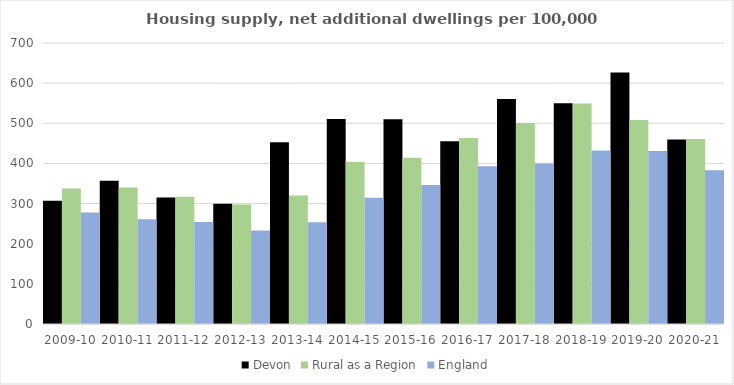
| Category | Devon | Rural as a Region | England |
|---|---|---|---|
| 2009-10 | 306.965 | 337.852 | 277.548 |
| 2010-11 | 356.742 | 340.105 | 260.994 |
| 2011-12 | 315.363 | 317.04 | 254.007 |
| 2012-13 | 299.561 | 297.763 | 233.153 |
| 2013-14 | 452.944 | 319.835 | 253.602 |
| 2014-15 | 510.656 | 403.796 | 314.256 |
| 2015-16 | 510.224 | 414.091 | 346.154 |
| 2016-17 | 455.298 | 463.209 | 393.256 |
| 2017-18 | 560.742 | 500.68 | 399.646 |
| 2018-19 | 549.739 | 549.491 | 432.099 |
| 2019-20 | 626.39 | 508.493 | 431.187 |
| 2020-21 | 459.594 | 461.114 | 382.827 |